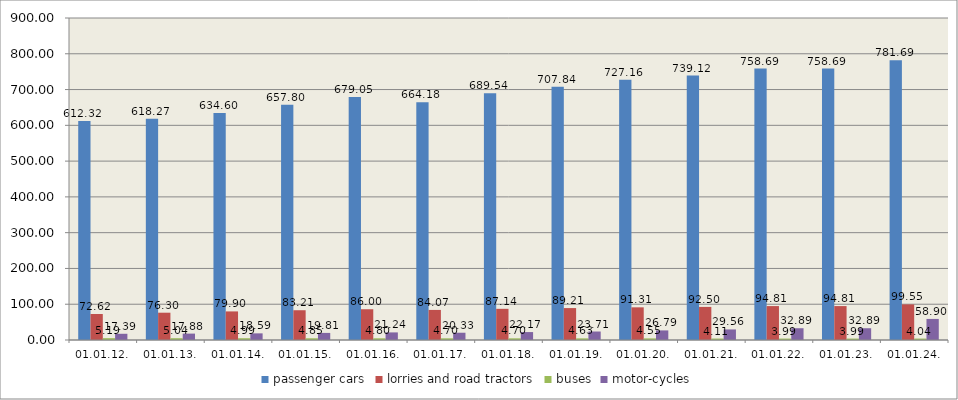
| Category | passenger cars | lorries and road tractors | buses | motor-cycles |
|---|---|---|---|---|
| 01.01.12. | 612.321 | 72.622 | 5.186 | 17.385 |
| 01.01.13. | 618.274 | 76.303 | 5.044 | 17.879 |
| 01.01.14. | 634.603 | 79.899 | 4.989 | 18.587 |
| 01.01.15. | 657.799 | 83.205 | 4.845 | 19.807 |
| 01.01.16. | 679.048 | 85.998 | 4.797 | 21.241 |
| 01.01.17. | 664.177 | 84.067 | 4.696 | 20.329 |
| 01.01.18. | 689.536 | 87.143 | 4.701 | 22.166 |
| 01.01.19. | 707.841 | 89.211 | 4.632 | 23.713 |
| 01.01.20. | 727.164 | 91.311 | 4.549 | 26.785 |
| 01.01.21. | 739.124 | 92.499 | 4.105 | 29.561 |
| 01.01.22. | 758.688 | 94.811 | 3.992 | 32.893 |
| 01.01.23. | 758.688 | 94.811 | 3.992 | 32.893 |
| 01.01.24. | 781.69 | 99.549 | 4.041 | 58.9 |